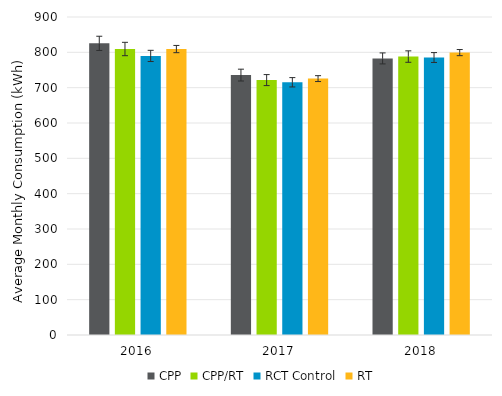
| Category | CPP | CPP/RT | RCT Control | RT |
|---|---|---|---|---|
| 2016.0 | 825.454 | 809.408 | 789.843 | 809.253 |
| 2017.0 | 735.59 | 721.45 | 715.262 | 725.615 |
| 2018.0 | 782.779 | 788.029 | 785.344 | 799.244 |